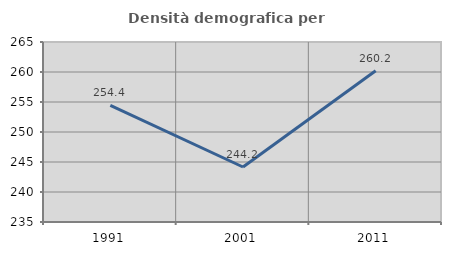
| Category | Densità demografica |
|---|---|
| 1991.0 | 254.446 |
| 2001.0 | 244.169 |
| 2011.0 | 260.217 |